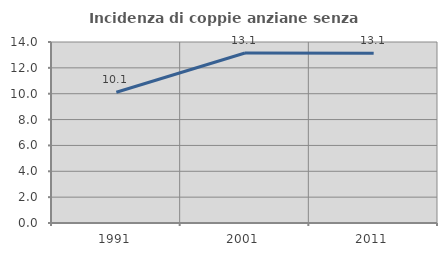
| Category | Incidenza di coppie anziane senza figli  |
|---|---|
| 1991.0 | 10.112 |
| 2001.0 | 13.15 |
| 2011.0 | 13.129 |